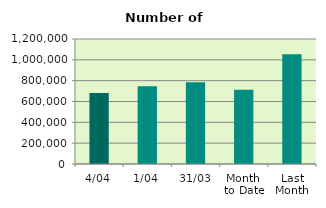
| Category | Series 0 |
|---|---|
| 4/04 | 681026 |
| 1/04 | 746604 |
| 31/03 | 783734 |
| Month 
to Date | 713815 |
| Last
Month | 1053589.478 |